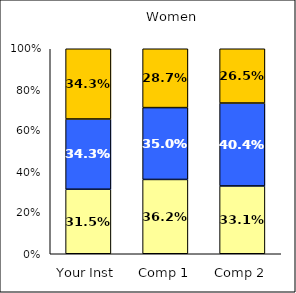
| Category | Low UG Ed Goal: Personal Development | Average UG Ed Goal: Personal Development | High UG Ed Goal: Personal Development |
|---|---|---|---|
| Your Inst | 0.315 | 0.343 | 0.343 |
| Comp 1 | 0.362 | 0.35 | 0.287 |
| Comp 2 | 0.331 | 0.404 | 0.265 |